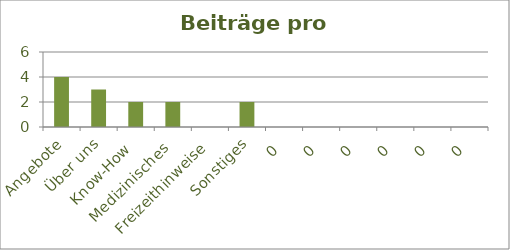
| Category | Beiträge |
|---|---|
| Angebote | 4 |
| Über uns | 3 |
| Know-How | 2 |
| Medizinisches | 2 |
| Freizeithinweise | 0 |
| Sonstiges | 2 |
| 0 | 0 |
| 0 | 0 |
| 0 | 0 |
| 0 | 0 |
| 0 | 0 |
| 0 | 0 |